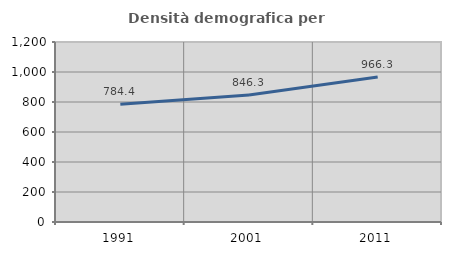
| Category | Densità demografica |
|---|---|
| 1991.0 | 784.42 |
| 2001.0 | 846.334 |
| 2011.0 | 966.315 |